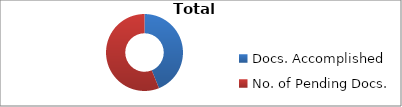
| Category | Total Documents |
|---|---|
| Docs. Accomplished | 25 |
| No. of Pending Docs. | 32 |